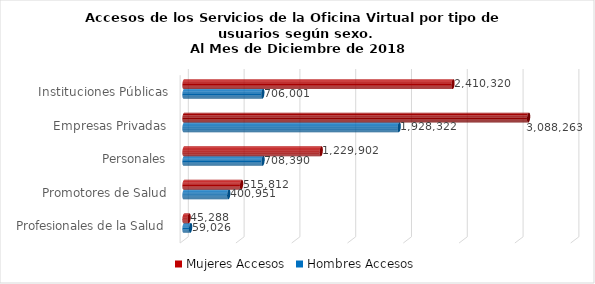
| Category | Mujeres | Hombres |
|---|---|---|
| Instituciones Públicas | 2410320 | 706001 |
| Empresas Privadas | 3088263 | 1928322 |
| Personales | 1229902 | 708390 |
| Promotores de Salud | 515812 | 400951 |
| Profesionales de la Salud | 45288 | 59026 |